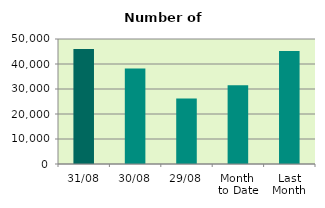
| Category | Series 0 |
|---|---|
| 31/08 | 45958 |
| 30/08 | 38190 |
| 29/08 | 26236 |
| Month 
to Date | 31456 |
| Last
Month | 45220.286 |